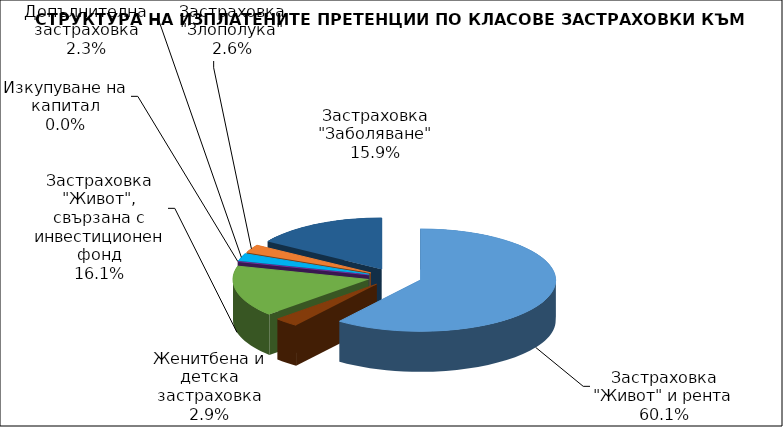
| Category | Застраховка "Живот" и рента |
|---|---|
| Застраховка "Живот" и рента | 54426065.977 |
| Женитбена и детска застраховка | 2639333.407 |
| Застраховка "Живот", свързана с инвестиционен фонд | 14606850.847 |
| Изкупуване на капитал | 0 |
| Допълнителна застраховка | 2124934.42 |
| Застраховка "Злополука" | 2310578.938 |
| Застраховка "Заболяване" | 14392529.936 |